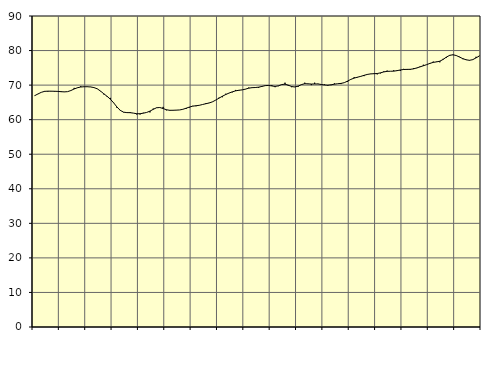
| Category | Piggar | Series 1 |
|---|---|---|
| nan | 67 | 66.94 |
| 87.0 | 67.4 | 67.44 |
| 87.0 | 67.9 | 67.9 |
| 87.0 | 68.3 | 68.19 |
| nan | 68.1 | 68.25 |
| 88.0 | 68.3 | 68.24 |
| 88.0 | 68.1 | 68.22 |
| 88.0 | 68.1 | 68.18 |
| nan | 68 | 68.1 |
| 89.0 | 68 | 68.04 |
| 89.0 | 68.1 | 68.11 |
| 89.0 | 68.4 | 68.43 |
| nan | 69.2 | 68.88 |
| 90.0 | 69.3 | 69.24 |
| 90.0 | 69.7 | 69.45 |
| 90.0 | 69.5 | 69.53 |
| nan | 69.6 | 69.53 |
| 91.0 | 69.5 | 69.46 |
| 91.0 | 69.3 | 69.29 |
| 91.0 | 68.9 | 68.93 |
| nan | 68.2 | 68.27 |
| 92.0 | 67.3 | 67.49 |
| 92.0 | 66.6 | 66.75 |
| 92.0 | 66.3 | 65.91 |
| nan | 64.9 | 64.85 |
| 93.0 | 63.4 | 63.65 |
| 93.0 | 62.8 | 62.69 |
| 93.0 | 62.1 | 62.17 |
| nan | 62.1 | 62.04 |
| 94.0 | 62.2 | 62.02 |
| 94.0 | 61.9 | 61.89 |
| 94.0 | 61.5 | 61.72 |
| nan | 61.5 | 61.72 |
| 95.0 | 62 | 61.88 |
| 95.0 | 62.1 | 62.09 |
| 95.0 | 62.1 | 62.47 |
| nan | 63.2 | 62.99 |
| 96.0 | 63.5 | 63.44 |
| 96.0 | 63.5 | 63.52 |
| 96.0 | 63.7 | 63.22 |
| nan | 62.7 | 62.87 |
| 97.0 | 62.8 | 62.71 |
| 97.0 | 62.7 | 62.72 |
| 97.0 | 62.8 | 62.76 |
| nan | 62.8 | 62.81 |
| 98.0 | 63 | 63 |
| 98.0 | 63.1 | 63.32 |
| 98.0 | 63.5 | 63.65 |
| nan | 64 | 63.91 |
| 99.0 | 63.9 | 64.03 |
| 99.0 | 64.2 | 64.16 |
| 99.0 | 64.4 | 64.39 |
| nan | 64.8 | 64.62 |
| 0.0 | 64.9 | 64.83 |
| 0.0 | 65.2 | 65.17 |
| 0.0 | 65.7 | 65.68 |
| nan | 66.4 | 66.24 |
| 1.0 | 66.5 | 66.79 |
| 1.0 | 67.5 | 67.27 |
| 1.0 | 67.7 | 67.69 |
| nan | 67.9 | 68.05 |
| 2.0 | 68.6 | 68.34 |
| 2.0 | 68.4 | 68.51 |
| 2.0 | 68.6 | 68.62 |
| nan | 68.8 | 68.84 |
| 3.0 | 69.3 | 69.11 |
| 3.0 | 69.3 | 69.26 |
| 3.0 | 69.2 | 69.3 |
| nan | 69.2 | 69.41 |
| 4.0 | 69.7 | 69.62 |
| 4.0 | 69.9 | 69.85 |
| 4.0 | 70 | 69.91 |
| nan | 70 | 69.76 |
| 5.0 | 69.4 | 69.62 |
| 5.0 | 69.7 | 69.79 |
| 5.0 | 70.2 | 70.16 |
| nan | 70.7 | 70.27 |
| 6.0 | 69.8 | 69.99 |
| 6.0 | 69.4 | 69.59 |
| 6.0 | 69.5 | 69.45 |
| nan | 69.5 | 69.71 |
| 7.0 | 70.2 | 70.15 |
| 7.0 | 70.7 | 70.4 |
| 7.0 | 70.3 | 70.37 |
| nan | 70 | 70.3 |
| 8.0 | 70.7 | 70.33 |
| 8.0 | 70.4 | 70.33 |
| 8.0 | 70.1 | 70.19 |
| nan | 70.2 | 70.04 |
| 9.0 | 69.8 | 69.98 |
| 9.0 | 70 | 70.09 |
| 9.0 | 70.5 | 70.27 |
| nan | 70.4 | 70.4 |
| 10.0 | 70.3 | 70.49 |
| 10.0 | 70.7 | 70.71 |
| 10.0 | 70.9 | 71.16 |
| nan | 71.7 | 71.66 |
| 11.0 | 72.3 | 72.03 |
| 11.0 | 72.2 | 72.29 |
| 11.0 | 72.6 | 72.53 |
| nan | 72.6 | 72.83 |
| 12.0 | 73 | 73.09 |
| 12.0 | 73.2 | 73.25 |
| 12.0 | 73.4 | 73.3 |
| nan | 73.1 | 73.36 |
| 13.0 | 73.4 | 73.55 |
| 13.0 | 74 | 73.82 |
| 13.0 | 74.2 | 73.98 |
| nan | 74 | 74.01 |
| 14.0 | 74.3 | 74.04 |
| 14.0 | 74.1 | 74.18 |
| 14.0 | 74.1 | 74.38 |
| nan | 74.7 | 74.52 |
| 15.0 | 74.4 | 74.55 |
| 15.0 | 74.4 | 74.57 |
| 15.0 | 74.9 | 74.7 |
| nan | 74.9 | 74.97 |
| 16.0 | 75.4 | 75.28 |
| 16.0 | 75.9 | 75.6 |
| 16.0 | 75.9 | 75.92 |
| nan | 76.2 | 76.29 |
| 17.0 | 76.8 | 76.58 |
| 17.0 | 76.8 | 76.72 |
| 17.0 | 76.6 | 76.92 |
| nan | 77.6 | 77.43 |
| 18.0 | 77.9 | 78.11 |
| 18.0 | 78.5 | 78.62 |
| 18.0 | 78.7 | 78.78 |
| nan | 78.5 | 78.56 |
| 19.0 | 78.2 | 78.11 |
| 19.0 | 77.5 | 77.66 |
| 19.0 | 77.4 | 77.32 |
| nan | 77.1 | 77.18 |
| 20.0 | 77.3 | 77.37 |
| 20.0 | 78.2 | 77.89 |
| 20.0 | 78.5 | 78.42 |